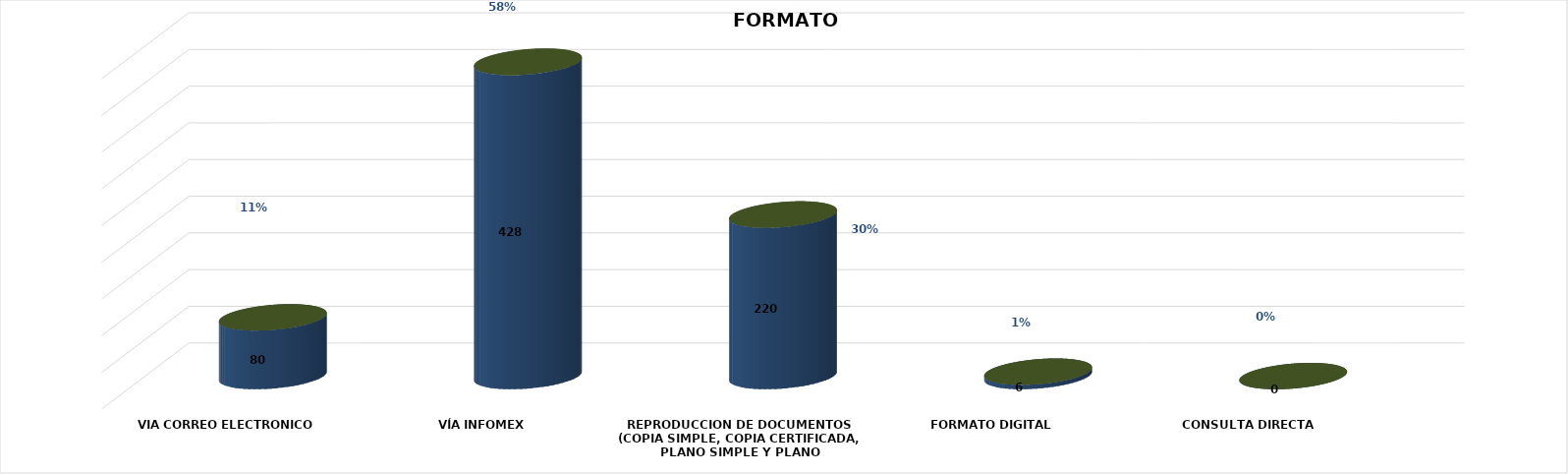
| Category | Series 0 | Series 1 | Series 2 | Series 3 | Series 4 |
|---|---|---|---|---|---|
| VIA CORREO ELECTRONICO |  |  |  | 80 | 0.109 |
| VÍA INFOMEX |  |  |  | 428 | 0.583 |
| REPRODUCCION DE DOCUMENTOS (COPIA SIMPLE, COPIA CERTIFICADA, PLANO SIMPLE Y PLANO CERTIFICADO) |  |  |  | 220 | 0.3 |
| FORMATO DIGITAL |  |  |  | 6 | 0.008 |
| CONSULTA DIRECTA |  |  |  | 0 | 0 |